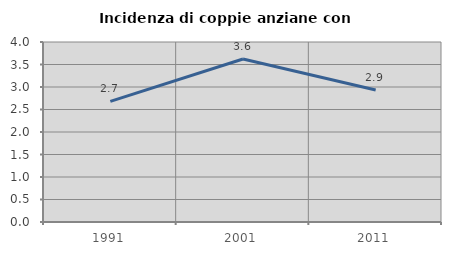
| Category | Incidenza di coppie anziane con figli |
|---|---|
| 1991.0 | 2.682 |
| 2001.0 | 3.623 |
| 2011.0 | 2.932 |